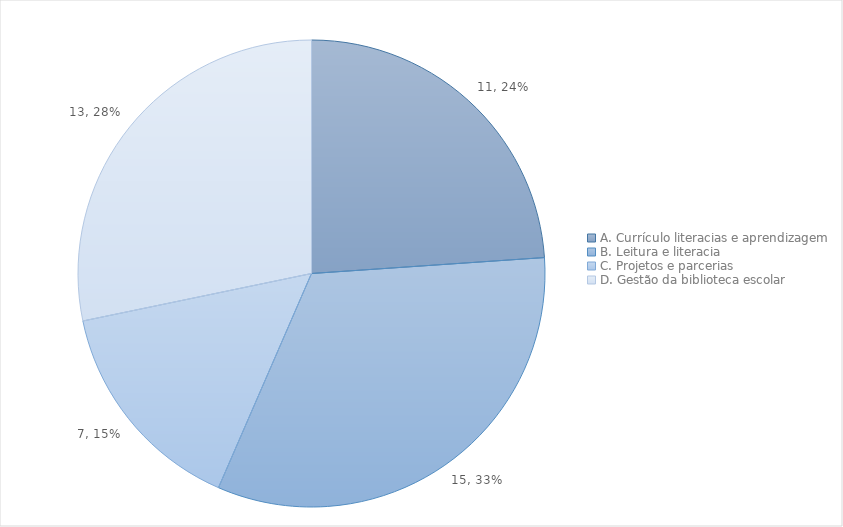
| Category | Series 0 |
|---|---|
| A. Currículo literacias e aprendizagem  | 11 |
| B. Leitura e literacia  | 15 |
| C. Projetos e parcerias  | 7 |
| D. Gestão da biblioteca escolar  | 13 |